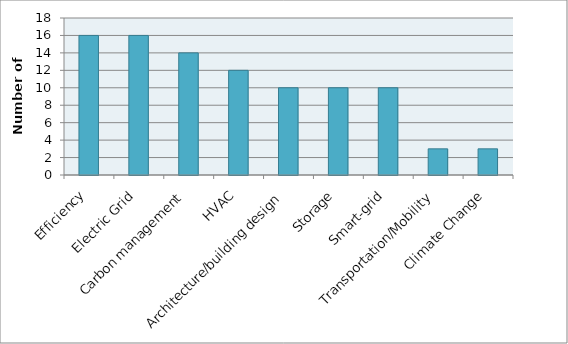
| Category | Series 0 |
|---|---|
| Efficiency | 16 |
| Electric Grid | 16 |
| Carbon management | 14 |
| HVAC | 12 |
| Architecture/building design | 10 |
| Storage | 10 |
| Smart-grid | 10 |
| Transportation/Mobility | 3 |
| Climate Change | 3 |